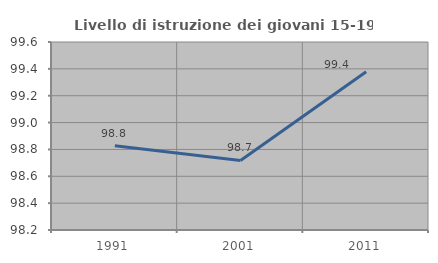
| Category | Livello di istruzione dei giovani 15-19 anni |
|---|---|
| 1991.0 | 98.828 |
| 2001.0 | 98.718 |
| 2011.0 | 99.379 |